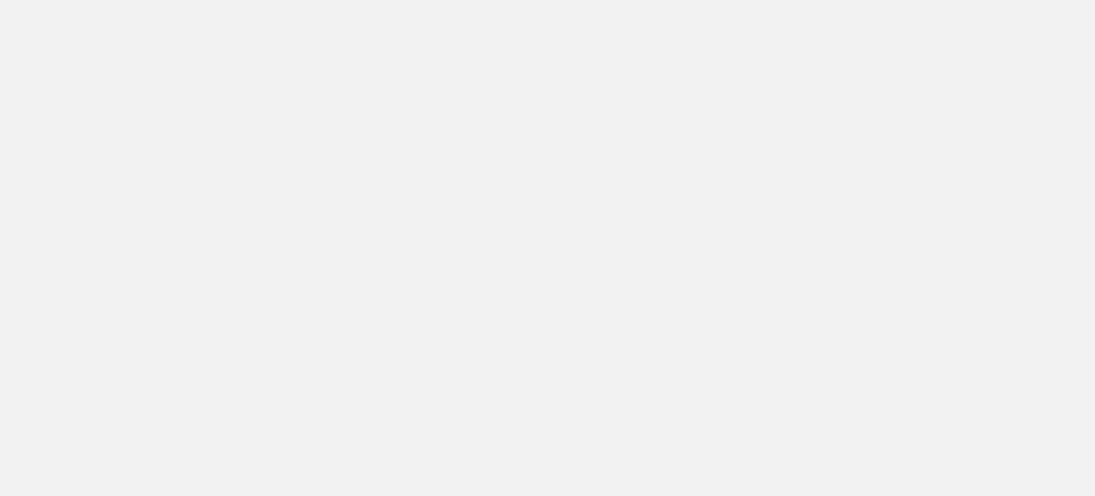
| Category | Total |
|---|---|
| Hajjah | 79082 |
| Al Hodeidah | 74867 |
| Marib | 42476 |
| Al Jawf | 14118 |
| Taiz | 12590 |
| Hadramawt | 8785 |
| Sadah | 5043 |
| Lahj | 4804 |
| Abyan | 4079 |
| Amran | 4050 |
| Sanaa | 3816 |
| Ad Dali | 3609 |
| Aden | 2914 |
| Ibb | 2432 |
| Al Bayda | 1590 |
| Dhamar | 1220 |
| Shabwah | 1007 |
| Al Mahwit | 595 |
| Raymah | 231 |
| Sanaa City | 167 |
| Al Maharah | 82 |
| Socotra | 15 |